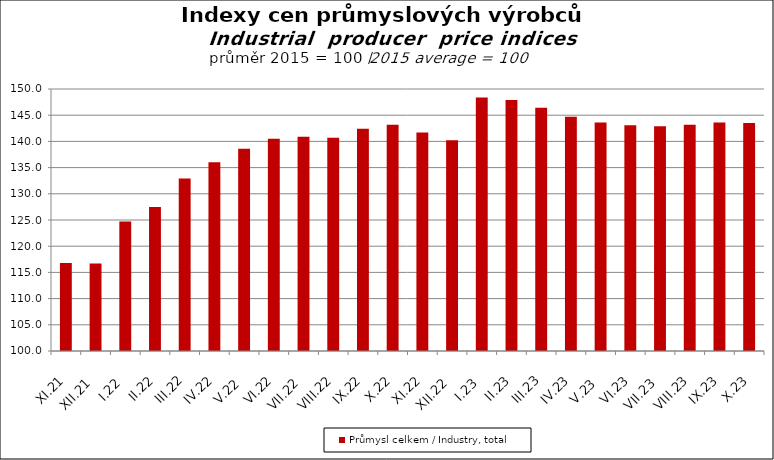
| Category | Průmysl celkem / Industry, total |
|---|---|
| XI.21 | 116.8 |
| XII.21 | 116.7 |
| I.22 | 124.7 |
| II.22 | 127.5 |
| III.22 | 132.9 |
| IV.22 | 136 |
| V.22 | 138.6 |
| VI.22 | 140.5 |
| VII.22 | 140.9 |
| VIII.22 | 140.7 |
| IX.22 | 142.4 |
| X.22 | 143.2 |
| XI.22 | 141.7 |
| XII.22 | 140.2 |
| I.23 | 148.4 |
| II.23 | 147.9 |
| III.23 | 146.4 |
| IV.23 | 144.7 |
| V.23 | 143.6 |
| VI.23 | 143.1 |
| VII.23 | 142.9 |
| VIII.23 | 143.2 |
| IX.23 | 143.6 |
| X.23 | 143.5 |